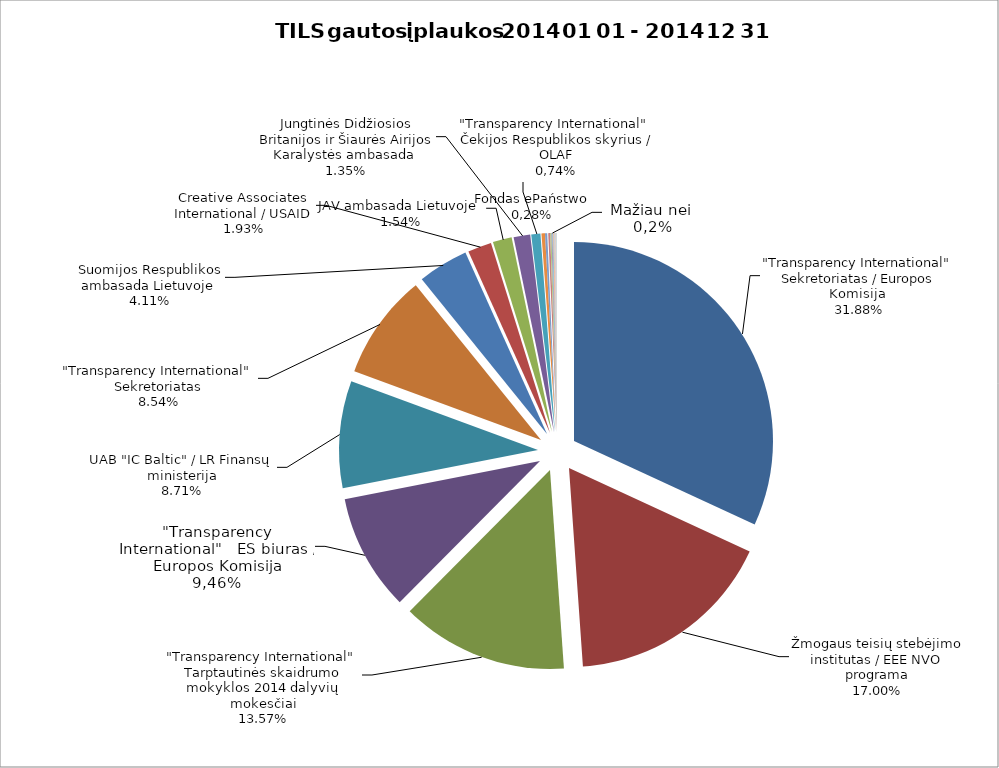
| Category | Įplaukos, LTL | Procentinė dalis, % |
|---|---|---|
| "Transparency International" Sekretoriatas / Europos Komisija  | 308089.47 | 31.881 |
| Žmogaus teisių stebėjimo institutas / EEE NVO programa | 164324.14 | 17.004 |
| "Transparency International" Tarptautinės skaidrumo mokyklos 2014 dalyvių mokesčiai | 131124.23 | 13.568 |
| "Transparency International" ES biuras / Europos Komisija | 91418.27 | 9.46 |
| UAB "IC Baltic" / LR Finansų ministerija | 84172.15 | 8.71 |
| "Transparency International" Sekretoriatas | 82572.4 | 8.544 |
| Suomijos Respublikos ambasada Lietuvoje  | 39707.2 | 4.109 |
| Creative Associates International / USAID | 18644.49 | 1.929 |
| JAV ambasada Lietuvoje  | 14878.89 | 1.54 |
| Jungtinės Didžiosios Britanijos ir Šiaurės Airijos Karalystės ambasada  | 13000 | 1.345 |
| "Transparency International" Čekijos Respublikos skyrius / Europos kovos su sukčiavimu tarnyba (OLAF) | 7174.92 | 0.742 |
| Fondas ePaństwo (Hakatono "Code for Freedom" prizas) | 2747.84 | 0.284 |
| Lenkijos Respublikos ambasada Lietuvoje | 1726.4 | 0.179 |
| Prancūzijos Respublikos ambasada  | 1517.24 | 0.157 |
| Europos profesinių sąjungų konfederacija (CESI) | 994.41 | 0.103 |
| Asociacija "Pilietinių iniciatyvų centras" | 740 | 0.077 |
| Aukos (fizinių asmenų)  | 740 | 0.077 |
| TILS skirtas gyventojų pajamų mokestis  | 702.58 | 0.073 |
| VšĮ "Geros valios projektai" (Iniciatyva "ManoSeimas.lt" ) | 565.39 | 0.059 |
| Asociacija "Nacionalinė krepšinio lyga" | 500 | 0.052 |
| VŠĮ "Antikorupcijos švietimo centras" | 448.29 | 0.046 |
| Šalčininkų rajono savivaldybės administracija | 300 | 0.031 |
| Dalininkų įnašai | 300 | 0.031 |